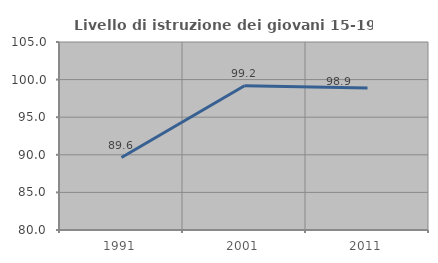
| Category | Livello di istruzione dei giovani 15-19 anni |
|---|---|
| 1991.0 | 89.636 |
| 2001.0 | 99.177 |
| 2011.0 | 98.87 |